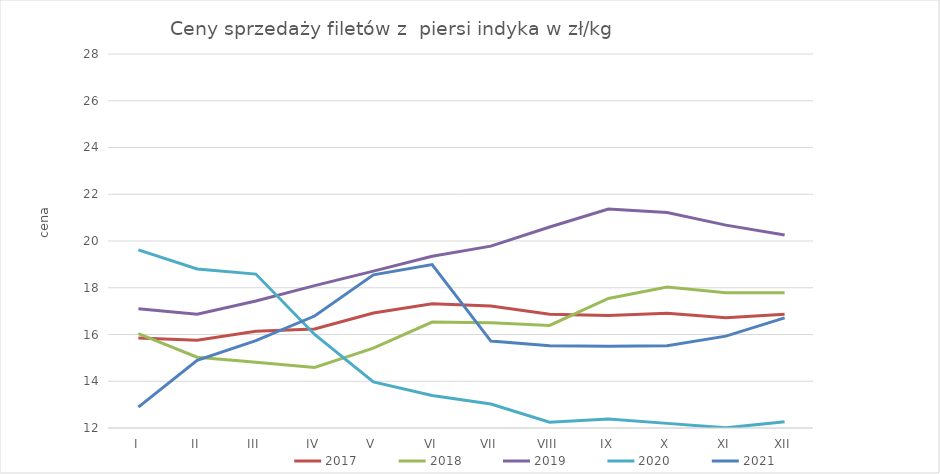
| Category | 2017 | 2018 | 2019 | 2020 | 2021 |
|---|---|---|---|---|---|
| I | 15.85 | 16.04 | 17.1 | 19.62 | 12.89 |
| II | 15.75 | 15.03 | 16.87 | 18.8 | 14.89 |
| III | 16.14 | 14.81 | 17.434 | 18.585 | 15.74 |
| IV | 16.24 | 14.59 | 18.09 | 16.001 | 16.79 |
| V | 16.92 | 15.42 | 18.71 | 13.97 | 18.55 |
| VI | 17.32 | 16.53 | 19.35 | 13.391 | 18.99 |
| VII | 17.217 | 16.5 | 19.78 | 13.025 | 15.72 |
| VIII | 16.87 | 16.39 | 20.6 | 12.249 | 15.521 |
| IX | 16.81 | 17.54 | 21.37 | 12.39 | 15.5 |
| X | 16.91 | 18.03 | 21.22 | 12.198 | 15.52 |
| XI | 16.72 | 17.79 | 20.68 | 12.006 | 15.93 |
| XII | 16.865 | 17.79 | 20.254 | 12.271 | 16.71 |